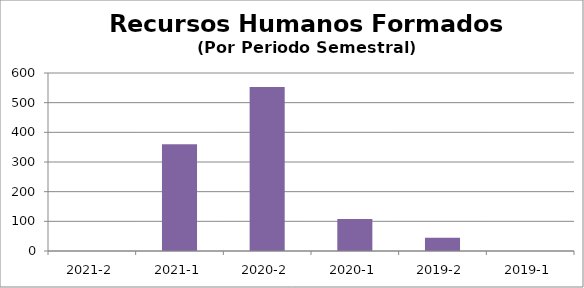
| Category | Recursos Humanos Formados (Por Periodo Semestral) |
|---|---|
| 2021-2 | 0 |
| 2021-1 | 360 |
| 2020-2 | 553 |
| 2020-1 | 108 |
| 2019-2 | 45 |
| 2019-1 | 0 |